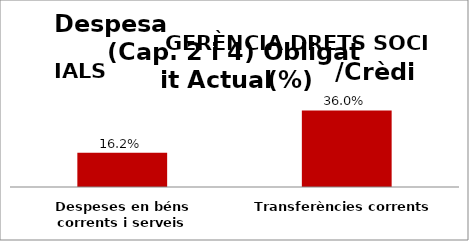
| Category | Series 0 |
|---|---|
| Despeses en béns corrents i serveis | 0.162 |
| Transferències corrents | 0.36 |